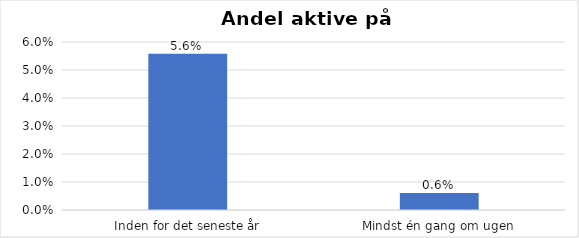
| Category | % |
|---|---|
| Inden for det seneste år | 0.056 |
| Mindst én gang om ugen | 0.006 |